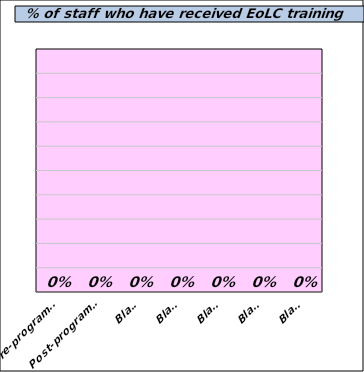
| Category | Series 0 |
|---|---|
| Pre-programme | 0 |
| Post-programme | 0 |
| Blank | 0 |
| Blank | 0 |
| Blank | 0 |
| Blank | 0 |
| Blank | 0 |